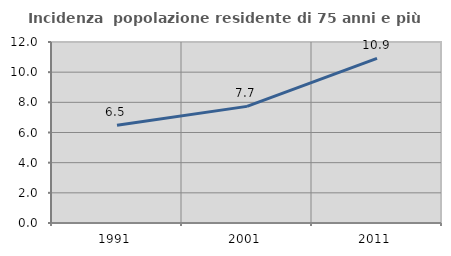
| Category | Incidenza  popolazione residente di 75 anni e più |
|---|---|
| 1991.0 | 6.486 |
| 2001.0 | 7.732 |
| 2011.0 | 10.92 |